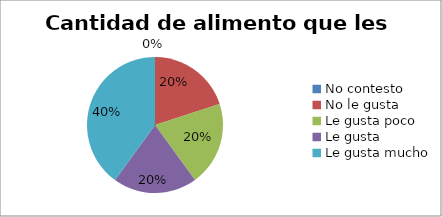
| Category | Series 0 |
|---|---|
| No contesto | 0 |
| No le gusta | 1 |
| Le gusta poco | 1 |
| Le gusta | 1 |
| Le gusta mucho | 2 |